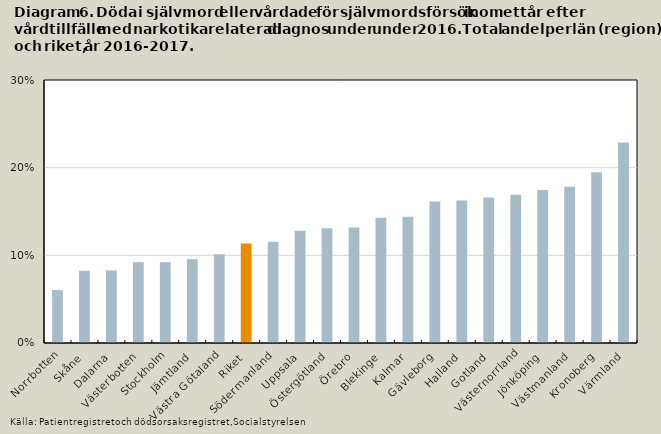
| Category | Totalt |
|---|---|
| Norrbotten | 0.06 |
| Skåne | 0.082 |
| Dalarna | 0.083 |
| Västerbotten | 0.092 |
| Stockholm | 0.092 |
| Jämtland | 0.096 |
| Västra Götaland | 0.101 |
| Riket | 0.113 |
| Södermanland | 0.115 |
| Uppsala | 0.128 |
| Östergötland | 0.131 |
| Örebro | 0.132 |
| Blekinge | 0.143 |
| Kalmar | 0.144 |
| Gävleborg | 0.162 |
| Halland | 0.163 |
| Gotland | 0.166 |
| Västernorrland | 0.169 |
| Jönköping | 0.174 |
| Västmanland | 0.178 |
| Kronoberg | 0.195 |
| Värmland | 0.229 |